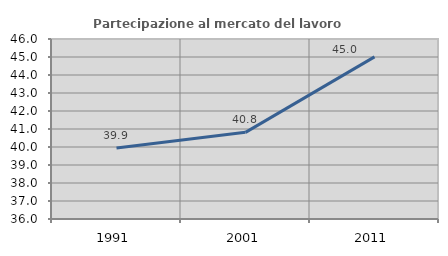
| Category | Partecipazione al mercato del lavoro  femminile |
|---|---|
| 1991.0 | 39.947 |
| 2001.0 | 40.814 |
| 2011.0 | 45.008 |